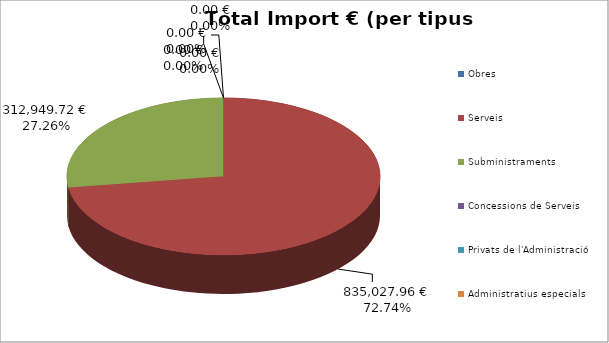
| Category | Total preu              (amb iva) |
|---|---|
| Obres | 0 |
| Serveis | 835027.96 |
| Subministraments | 312949.72 |
| Concessions de Serveis | 0 |
| Privats de l'Administració | 0 |
| Administratius especials | 0 |